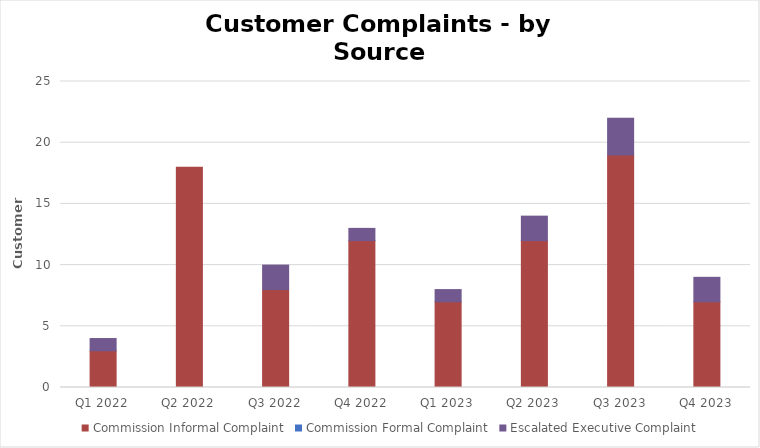
| Category | Commission Informal Complaint | Commission Formal Complaint | Escalated Executive Complaint |
|---|---|---|---|
| Q1 2022 | 3 | 0 | 1 |
| Q2 2022 | 18 | 0 | 0 |
| Q3 2022 | 8 | 0 | 2 |
| Q4 2022 | 12 | 0 | 1 |
| Q1 2023 | 7 | 0 | 1 |
| Q2 2023 | 12 | 0 | 2 |
| Q3 2023 | 19 | 0 | 3 |
| Q4 2023 | 7 | 0 | 2 |